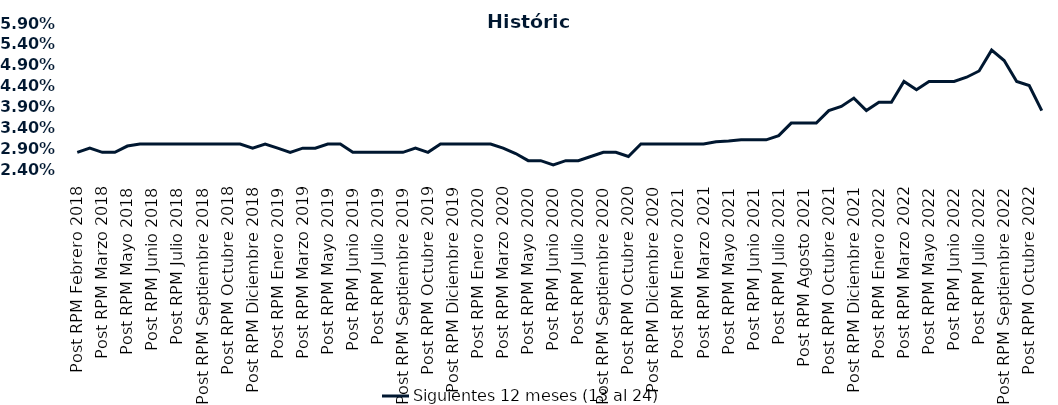
| Category | Siguientes 12 meses (13 al 24)  |
|---|---|
| Post RPM Febrero 2018 | 0.028 |
| Pre RPM Marzo 2018 | 0.029 |
| Post RPM Marzo 2018 | 0.028 |
| Pre RPM Mayo 2018 | 0.028 |
| Post RPM Mayo 2018 | 0.03 |
| Pre RPM Junio 2018 | 0.03 |
| Post RPM Junio 2018 | 0.03 |
| Pre RPM Julio 2018 | 0.03 |
| Post RPM Julio 2018 | 0.03 |
| Pre RPM Septiembre 2018 | 0.03 |
| Post RPM Septiembre 2018 | 0.03 |
| Pre RPM Octubre 2018 | 0.03 |
| Post RPM Octubre 2018 | 0.03 |
| Pre RPM Diciembre 2018 | 0.03 |
| Post RPM Diciembre 2018 | 0.029 |
| Pre RPM Enero 2019 | 0.03 |
| Post RPM Enero 2019 | 0.029 |
| Pre RPM Marzo 2019 | 0.028 |
| Post RPM Marzo 2019 | 0.029 |
| Pre RPM Mayo 2019 | 0.029 |
| Post RPM Mayo 2019 | 0.03 |
| Pre RPM Junio 2019 | 0.03 |
| Post RPM Junio 2019 | 0.028 |
| Pre RPM Julio 2019 | 0.028 |
| Post RPM Julio 2019 | 0.028 |
| Pre RPM Septiembre 2019 | 0.028 |
| Post RPM Septiembre 2019 | 0.028 |
| Pre RPM Octubre 2019 | 0.029 |
| Post RPM Octubre 2019 | 0.028 |
| Pre RPM Diciembre 2019 | 0.03 |
| Post RPM Diciembre 2019 | 0.03 |
| Pre RPM Enero 2020 | 0.03 |
| Post RPM Enero 2020 | 0.03 |
| Pre RPM Marzo 2020 | 0.03 |
| Post RPM Marzo 2020 | 0.029 |
| Pre RPM Mayo 2020 | 0.028 |
| Post RPM Mayo 2020 | 0.026 |
| Pre RPM Junio 2020 | 0.026 |
| Post RPM Junio 2020 | 0.025 |
| Pre RPM Julio 2020 | 0.026 |
| Post RPM Julio 2020 | 0.026 |
| Pre RPM Septiembre 2020 | 0.027 |
| Post RPM Septiembre 2020 | 0.028 |
| Pre RPM Octubre 2020 | 0.028 |
| Post RPM Octubre 2020 | 0.027 |
| Pre RPM Diciembre 2020 | 0.03 |
| Post RPM Diciembre 2020 | 0.03 |
| Pre RPM Enero 2021 | 0.03 |
| Post RPM Enero 2021 | 0.03 |
| Pre RPM Marzo 2021 | 0.03 |
| Post RPM Marzo 2021 | 0.03 |
| Pre RPM Mayo 2021 | 0.031 |
| Post RPM Mayo 2021 | 0.031 |
| Pre RPM Junio 2021 | 0.031 |
| Post RPM Junio 2021 | 0.031 |
| Pre RPM Julio 2021 | 0.031 |
| Post RPM Julio 2021 | 0.032 |
| Pre RPM Agosto 2021 | 0.035 |
| Post RPM Agosto 2021 | 0.035 |
| Pre RPM Octubre 2021 | 0.035 |
| Post RPM Octubre 2021 | 0.038 |
| Pre RPM Diciembre 2021 | 0.039 |
| Post RPM Diciembre 2021 | 0.041 |
| Pre RPM Enero 2022 | 0.038 |
| Post RPM Enero 2022 | 0.04 |
| Pre RPM Marzo 2022 | 0.04 |
| Post RPM Marzo 2022 | 0.045 |
| Pre RPM Mayo 2022 | 0.043 |
| Post RPM Mayo 2022 | 0.045 |
| Pre RPM Junio 2022 | 0.045 |
| Post RPM Junio 2022 | 0.045 |
| Pre RPM Julio 2022 | 0.046 |
| Post RPM Julio 2022 | 0.048 |
| Pre RPM Septiembre 2022 | 0.052 |
| Post RPM Septiembre 2022 | 0.05 |
| Pre RPM Octubre 2022 | 0.045 |
| Post RPM Octubre 2022 | 0.044 |
| Pre RPM Diciembre 2022 | 0.038 |